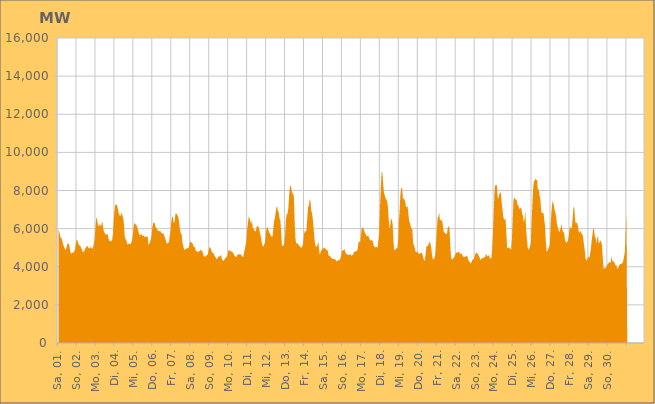
| Category | Series 0 |
|---|---|
|  Sa, 01.  | 5986.198 |
|  Sa, 01.  | 5851.716 |
|  Sa, 01.  | 5665.859 |
|  Sa, 01.  | 5525.576 |
|  Sa, 01.  | 5490.964 |
|  Sa, 01.  | 5345.422 |
|  Sa, 01.  | 5175.467 |
|  Sa, 01.  | 5066.246 |
|  Sa, 01.  | 4964.411 |
|  Sa, 01.  | 4859.392 |
|  Sa, 01.  | 4981.299 |
|  Sa, 01.  | 5156.284 |
|  Sa, 01.  | 5203.352 |
|  Sa, 01.  | 5224.294 |
|  Sa, 01.  | 5064.415 |
|  Sa, 01.  | 4799.154 |
|  Sa, 01.  | 4692.39 |
|  So, 02.  | 4701.01 |
|  So, 02.  | 4738.124 |
|  So, 02.  | 4750.208 |
|  So, 02.  | 4797.907 |
|  So, 02.  | 4901.259 |
|  So, 02.  | 5133.199 |
|  So, 02.  | 5404.292 |
|  So, 02.  | 5409.799 |
|  So, 02.  | 5249.454 |
|  So, 02.  | 5146.405 |
|  So, 02.  | 5105.129 |
|  So, 02.  | 5077.2 |
|  So, 02.  | 4963.275 |
|  So, 02.  | 4877.738 |
|  So, 02.  | 4746.793 |
|  So, 02.  | 4789.26 |
|  So, 02.  | 4837.976 |
|  So, 02.  | 4972.258 |
|  So, 02.  | 5001.209 |
|  So, 02.  | 5090.201 |
|  So, 02.  | 5071.623 |
|  So, 02.  | 4992.963 |
|  So, 02.  | 4963.147 |
|  So, 02.  | 4970.084 |
|  Mo, 03.  | 5050.649 |
|  Mo, 03.  | 4982.216 |
|  Mo, 03.  | 4929.272 |
|  Mo, 03.  | 5025.858 |
|  Mo, 03.  | 5231.767 |
|  Mo, 03.  | 5485.965 |
|  Mo, 03.  | 6151.951 |
|  Mo, 03.  | 6603.216 |
|  Mo, 03.  | 6448.466 |
|  Mo, 03.  | 6229.15 |
|  Mo, 03.  | 6100.831 |
|  Mo, 03.  | 6217.637 |
|  Mo, 03.  | 6217.682 |
|  Mo, 03.  | 6105.206 |
|  Mo, 03.  | 6325.348 |
|  Mo, 03.  | 6302.314 |
|  Mo, 03.  | 5946.717 |
|  Mo, 03.  | 5796.827 |
|  Mo, 03.  | 5766.763 |
|  Mo, 03.  | 5642.512 |
|  Mo, 03.  | 5713.603 |
|  Mo, 03.  | 5729.058 |
|  Mo, 03.  | 5577.282 |
|  Mo, 03.  | 5364.547 |
|  Di, 04.  | 5369.278 |
|  Di, 04.  | 5321.963 |
|  Di, 04.  | 5358.114 |
|  Di, 04.  | 5394.184 |
|  Di, 04.  | 5716.389 |
|  Di, 04.  | 6404.431 |
|  Di, 04.  | 6966.311 |
|  Di, 04.  | 7244.627 |
|  Di, 04.  | 7274.732 |
|  Di, 04.  | 7248.583 |
|  Di, 04.  | 7091.509 |
|  Di, 04.  | 6866.441 |
|  Di, 04.  | 6750.98 |
|  Di, 04.  | 6649.284 |
|  Di, 04.  | 6712.508 |
|  Di, 04.  | 6850.34 |
|  Di, 04.  | 6682.705 |
|  Di, 04.  | 6564.801 |
|  Di, 04.  | 6210.16 |
|  Di, 04.  | 5587.202 |
|  Di, 04.  | 5452.3 |
|  Di, 04.  | 5366.774 |
|  Di, 04.  | 5219.316 |
|  Di, 04.  | 5155.671 |
|  Mi, 05.  | 5220.792 |
|  Mi, 05.  | 5237.349 |
|  Mi, 05.  | 5152.427 |
|  Mi, 05.  | 5241.705 |
|  Mi, 05.  | 5363.147 |
|  Mi, 05.  | 5559.005 |
|  Mi, 05.  | 6037.3 |
|  Mi, 05.  | 6308.622 |
|  Mi, 05.  | 6242.978 |
|  Mi, 05.  | 6207.199 |
|  Mi, 05.  | 6173.768 |
|  Mi, 05.  | 6039.272 |
|  Mi, 05.  | 5904.469 |
|  Mi, 05.  | 5726.8 |
|  Mi, 05.  | 5648.026 |
|  Mi, 05.  | 5649.455 |
|  Mi, 05.  | 5753.626 |
|  Mi, 05.  | 5630.197 |
|  Mi, 05.  | 5642.762 |
|  Mi, 05.  | 5620.626 |
|  Mi, 05.  | 5556.902 |
|  Mi, 05.  | 5576.803 |
|  Mi, 05.  | 5567.333 |
|  Mi, 05.  | 5589.218 |
|  Do, 06.  | 5592.973 |
|  Do, 06.  | 5123.907 |
|  Do, 06.  | 5202.075 |
|  Do, 06.  | 5297.194 |
|  Do, 06.  | 5432.616 |
|  Do, 06.  | 5669.47 |
|  Do, 06.  | 6082.247 |
|  Do, 06.  | 6300.495 |
|  Do, 06.  | 6320.121 |
|  Do, 06.  | 6273.655 |
|  Do, 06.  | 6094.1 |
|  Do, 06.  | 5994.084 |
|  Do, 06.  | 5999.222 |
|  Do, 06.  | 5869.058 |
|  Do, 06.  | 5886.096 |
|  Do, 06.  | 5862.3 |
|  Do, 06.  | 5895.214 |
|  Do, 06.  | 5784.538 |
|  Do, 06.  | 5783.343 |
|  Do, 06.  | 5711.813 |
|  Do, 06.  | 5759.064 |
|  Do, 06.  | 5636.405 |
|  Do, 06.  | 5500.982 |
|  Do, 06.  | 5390.22 |
|  Fr, 07.  | 5217.608 |
|  Fr, 07.  | 5226.2 |
|  Fr, 07.  | 5254.497 |
|  Fr, 07.  | 5293.826 |
|  Fr, 07.  | 5655.095 |
|  Fr, 07.  | 5896.305 |
|  Fr, 07.  | 6374.028 |
|  Fr, 07.  | 6640.231 |
|  Fr, 07.  | 6586.318 |
|  Fr, 07.  | 6303.294 |
|  Fr, 07.  | 6333.069 |
|  Fr, 07.  | 6733.798 |
|  Fr, 07.  | 6814.319 |
|  Fr, 07.  | 6737.536 |
|  Fr, 07.  | 6664.447 |
|  Fr, 07.  | 6575.157 |
|  Fr, 07.  | 6244.352 |
|  Fr, 07.  | 5917.623 |
|  Fr, 07.  | 5738.251 |
|  Fr, 07.  | 5688.585 |
|  Fr, 07.  | 5279.098 |
|  Fr, 07.  | 5089.484 |
|  Fr, 07.  | 4923.09 |
|  Fr, 07.  | 4886.802 |
|  Sa, 08.  | 4920.208 |
|  Sa, 08.  | 4956.678 |
|  Sa, 08.  | 4966.173 |
|  Sa, 08.  | 4983.251 |
|  Sa, 08.  | 5000.741 |
|  Sa, 08.  | 5191.07 |
|  Sa, 08.  | 5337.723 |
|  Sa, 08.  | 5254.819 |
|  Sa, 08.  | 5288.232 |
|  Sa, 08.  | 5201.02 |
|  Sa, 08.  | 5067.645 |
|  Sa, 08.  | 5030.667 |
|  Sa, 08.  | 5015.464 |
|  Sa, 08.  | 4807.369 |
|  Sa, 08.  | 4832.864 |
|  Sa, 08.  | 4771.201 |
|  Sa, 08.  | 4760.364 |
|  Sa, 08.  | 4831.947 |
|  Sa, 08.  | 4825.434 |
|  Sa, 08.  | 4908.169 |
|  Sa, 08.  | 4844.909 |
|  Sa, 08.  | 4836.937 |
|  Sa, 08.  | 4687.435 |
|  Sa, 08.  | 4545.265 |
|  So, 09.  | 4560.465 |
|  So, 09.  | 4524.437 |
|  So, 09.  | 4573.328 |
|  So, 09.  | 4606.458 |
|  So, 09.  | 4654.101 |
|  So, 09.  | 4828.246 |
|  So, 09.  | 5024.234 |
|  So, 09.  | 5015.126 |
|  So, 09.  | 4939.169 |
|  So, 09.  | 4809.438 |
|  So, 09.  | 4737.247 |
|  So, 09.  | 4718.937 |
|  So, 09.  | 4649.321 |
|  So, 09.  | 4556.93 |
|  So, 09.  | 4491.298 |
|  So, 09.  | 4423.45 |
|  So, 09.  | 4402.622 |
|  So, 09.  | 4513.211 |
|  So, 09.  | 4534.018 |
|  So, 09.  | 4537.643 |
|  So, 09.  | 4573.7 |
|  So, 09.  | 4610.516 |
|  So, 09.  | 4403.32 |
|  So, 09.  | 4328.008 |
|  Mo, 10.  | 4313.69 |
|  Mo, 10.  | 4350.451 |
|  Mo, 10.  | 4454.101 |
|  Mo, 10.  | 4471.908 |
|  Mo, 10.  | 4525.516 |
|  Mo, 10.  | 4589.599 |
|  Mo, 10.  | 4835.402 |
|  Mo, 10.  | 4875.788 |
|  Mo, 10.  | 4849.937 |
|  Mo, 10.  | 4811.948 |
|  Mo, 10.  | 4783.219 |
|  Mo, 10.  | 4804.859 |
|  Mo, 10.  | 4700.804 |
|  Mo, 10.  | 4693.104 |
|  Mo, 10.  | 4559.146 |
|  Mo, 10.  | 4538.54 |
|  Mo, 10.  | 4503.301 |
|  Mo, 10.  | 4586.425 |
|  Mo, 10.  | 4633.529 |
|  Mo, 10.  | 4654.224 |
|  Mo, 10.  | 4638.368 |
|  Mo, 10.  | 4665.499 |
|  Mo, 10.  | 4629.46 |
|  Mo, 10.  | 4584.774 |
|  Di, 11.  | 4515.636 |
|  Di, 11.  | 4513.594 |
|  Di, 11.  | 4749.006 |
|  Di, 11.  | 4923.289 |
|  Di, 11.  | 5166.781 |
|  Di, 11.  | 5410.52 |
|  Di, 11.  | 5993.565 |
|  Di, 11.  | 6314.311 |
|  Di, 11.  | 6644.665 |
|  Di, 11.  | 6548.064 |
|  Di, 11.  | 6389.762 |
|  Di, 11.  | 6241.821 |
|  Di, 11.  | 6447.271 |
|  Di, 11.  | 6018.247 |
|  Di, 11.  | 6006.331 |
|  Di, 11.  | 5917.129 |
|  Di, 11.  | 5854.363 |
|  Di, 11.  | 5881.058 |
|  Di, 11.  | 6117.571 |
|  Di, 11.  | 6135.015 |
|  Di, 11.  | 6126.246 |
|  Di, 11.  | 6013.85 |
|  Di, 11.  | 5793.643 |
|  Di, 11.  | 5616.036 |
|  Mi, 12.  | 5350.768 |
|  Mi, 12.  | 5140.144 |
|  Mi, 12.  | 5057.796 |
|  Mi, 12.  | 5103.276 |
|  Mi, 12.  | 5215.764 |
|  Mi, 12.  | 5400.214 |
|  Mi, 12.  | 5881.592 |
|  Mi, 12.  | 6079.563 |
|  Mi, 12.  | 6057.197 |
|  Mi, 12.  | 5897.177 |
|  Mi, 12.  | 5785.509 |
|  Mi, 12.  | 5716.352 |
|  Mi, 12.  | 5617.394 |
|  Mi, 12.  | 5577.19 |
|  Mi, 12.  | 5565.1 |
|  Mi, 12.  | 5971.671 |
|  Mi, 12.  | 6404.574 |
|  Mi, 12.  | 6553.018 |
|  Mi, 12.  | 6847.14 |
|  Mi, 12.  | 7125.42 |
|  Mi, 12.  | 7153.375 |
|  Mi, 12.  | 6910.197 |
|  Mi, 12.  | 6839.746 |
|  Mi, 12.  | 6503.308 |
|  Do, 13.  | 6433.625 |
|  Do, 13.  | 5731.408 |
|  Do, 13.  | 5111.768 |
|  Do, 13.  | 5086.446 |
|  Do, 13.  | 5128.565 |
|  Do, 13.  | 5227.96 |
|  Do, 13.  | 5661.708 |
|  Do, 13.  | 6473.824 |
|  Do, 13.  | 6789.672 |
|  Do, 13.  | 6749.167 |
|  Do, 13.  | 7037.479 |
|  Do, 13.  | 7698.574 |
|  Do, 13.  | 8151.005 |
|  Do, 13.  | 8297.964 |
|  Do, 13.  | 8062.462 |
|  Do, 13.  | 7878.674 |
|  Do, 13.  | 7816.829 |
|  Do, 13.  | 7726.26 |
|  Do, 13.  | 6384.504 |
|  Do, 13.  | 5497.894 |
|  Do, 13.  | 5217.125 |
|  Do, 13.  | 5219.659 |
|  Do, 13.  | 5232.731 |
|  Do, 13.  | 5126.546 |
|  Fr, 14.  | 5113.975 |
|  Fr, 14.  | 5040.781 |
|  Fr, 14.  | 4987.049 |
|  Fr, 14.  | 5039.468 |
|  Fr, 14.  | 5082.219 |
|  Fr, 14.  | 5319.642 |
|  Fr, 14.  | 5723.604 |
|  Fr, 14.  | 5893.5 |
|  Fr, 14.  | 5830.553 |
|  Fr, 14.  | 5925.785 |
|  Fr, 14.  | 6526.251 |
|  Fr, 14.  | 7167.226 |
|  Fr, 14.  | 7160.532 |
|  Fr, 14.  | 7540.664 |
|  Fr, 14.  | 7449.462 |
|  Fr, 14.  | 6941.866 |
|  Fr, 14.  | 6809.054 |
|  Fr, 14.  | 6517.055 |
|  Fr, 14.  | 6010.954 |
|  Fr, 14.  | 5513.725 |
|  Fr, 14.  | 5168.556 |
|  Fr, 14.  | 5047.032 |
|  Fr, 14.  | 5046.815 |
|  Fr, 14.  | 5144.114 |
|  Sa, 15.  | 5326.562 |
|  Sa, 15.  | 4879.498 |
|  Sa, 15.  | 4625.235 |
|  Sa, 15.  | 4770.753 |
|  Sa, 15.  | 4869.31 |
|  Sa, 15.  | 4922.679 |
|  Sa, 15.  | 5028.747 |
|  Sa, 15.  | 4927.38 |
|  Sa, 15.  | 5008.507 |
|  Sa, 15.  | 4956.719 |
|  Sa, 15.  | 4857.615 |
|  Sa, 15.  | 4919.958 |
|  Sa, 15.  | 4823.856 |
|  Sa, 15.  | 4580.557 |
|  Sa, 15.  | 4587.427 |
|  Sa, 15.  | 4543.437 |
|  Sa, 15.  | 4460.201 |
|  Sa, 15.  | 4464.991 |
|  Sa, 15.  | 4403.821 |
|  Sa, 15.  | 4414.485 |
|  Sa, 15.  | 4394.965 |
|  Sa, 15.  | 4397.61 |
|  Sa, 15.  | 4368.478 |
|  Sa, 15.  | 4269.901 |
|  So, 16.  | 4315.484 |
|  So, 16.  | 4351.759 |
|  So, 16.  | 4328.83 |
|  So, 16.  | 4355.487 |
|  So, 16.  | 4460.689 |
|  So, 16.  | 4569.429 |
|  So, 16.  | 4834.414 |
|  So, 16.  | 4844.176 |
|  So, 16.  | 4869.942 |
|  So, 16.  | 4952.319 |
|  So, 16.  | 4772.661 |
|  So, 16.  | 4698.097 |
|  So, 16.  | 4661.702 |
|  So, 16.  | 4629.209 |
|  So, 16.  | 4620.665 |
|  So, 16.  | 4631.716 |
|  So, 16.  | 4634.084 |
|  So, 16.  | 4655.039 |
|  So, 16.  | 4569.875 |
|  So, 16.  | 4609.234 |
|  So, 16.  | 4628.559 |
|  So, 16.  | 4767.856 |
|  So, 16.  | 4783.526 |
|  So, 16.  | 4810.766 |
|  Mo, 17.  | 4815.53 |
|  Mo, 17.  | 4825.86 |
|  Mo, 17.  | 4977.354 |
|  Mo, 17.  | 5322.576 |
|  Mo, 17.  | 5326.058 |
|  Mo, 17.  | 5255.659 |
|  Mo, 17.  | 5640.374 |
|  Mo, 17.  | 6018.336 |
|  Mo, 17.  | 6072.486 |
|  Mo, 17.  | 6013.517 |
|  Mo, 17.  | 5908.31 |
|  Mo, 17.  | 5765.806 |
|  Mo, 17.  | 5709.417 |
|  Mo, 17.  | 5594.468 |
|  Mo, 17.  | 5605.154 |
|  Mo, 17.  | 5635.342 |
|  Mo, 17.  | 5548.649 |
|  Mo, 17.  | 5432.43 |
|  Mo, 17.  | 5388.381 |
|  Mo, 17.  | 5371.203 |
|  Mo, 17.  | 5396.32 |
|  Mo, 17.  | 5335.188 |
|  Mo, 17.  | 5108.107 |
|  Mo, 17.  | 5076.283 |
|  Di, 18.  | 5002.953 |
|  Di, 18.  | 5045.017 |
|  Di, 18.  | 5038.616 |
|  Di, 18.  | 4981.414 |
|  Di, 18.  | 5379.975 |
|  Di, 18.  | 5773.671 |
|  Di, 18.  | 7022.398 |
|  Di, 18.  | 8038.352 |
|  Di, 18.  | 8928.718 |
|  Di, 18.  | 8984.47 |
|  Di, 18.  | 8381.545 |
|  Di, 18.  | 7911.576 |
|  Di, 18.  | 7754.579 |
|  Di, 18.  | 7607.03 |
|  Di, 18.  | 7521.693 |
|  Di, 18.  | 7451.32 |
|  Di, 18.  | 7187.495 |
|  Di, 18.  | 6534.141 |
|  Di, 18.  | 5982.196 |
|  Di, 18.  | 6179.521 |
|  Di, 18.  | 6521.78 |
|  Di, 18.  | 6462.776 |
|  Di, 18.  | 6260.197 |
|  Di, 18.  | 5369.708 |
|  Mi, 19.  | 4887.347 |
|  Mi, 19.  | 4885.413 |
|  Mi, 19.  | 4909.748 |
|  Mi, 19.  | 4995.699 |
|  Mi, 19.  | 4938.972 |
|  Mi, 19.  | 5334.404 |
|  Mi, 19.  | 6361.133 |
|  Mi, 19.  | 7028.438 |
|  Mi, 19.  | 7843.639 |
|  Mi, 19.  | 8116.473 |
|  Mi, 19.  | 8173.435 |
|  Mi, 19.  | 7636.002 |
|  Mi, 19.  | 7547.967 |
|  Mi, 19.  | 7521.281 |
|  Mi, 19.  | 7416.236 |
|  Mi, 19.  | 7117.726 |
|  Mi, 19.  | 7157.673 |
|  Mi, 19.  | 7155.243 |
|  Mi, 19.  | 6787.61 |
|  Mi, 19.  | 6365.825 |
|  Mi, 19.  | 6313.912 |
|  Mi, 19.  | 6113.234 |
|  Mi, 19.  | 5989.942 |
|  Mi, 19.  | 5972.191 |
|  Do, 20.  | 5263.174 |
|  Do, 20.  | 5137.708 |
|  Do, 20.  | 5015.659 |
|  Do, 20.  | 4792.31 |
|  Do, 20.  | 4787.252 |
|  Do, 20.  | 4740.29 |
|  Do, 20.  | 4804.733 |
|  Do, 20.  | 4671.639 |
|  Do, 20.  | 4671.021 |
|  Do, 20.  | 4695.936 |
|  Do, 20.  | 4735.164 |
|  Do, 20.  | 4719.327 |
|  Do, 20.  | 4623.682 |
|  Do, 20.  | 4440.571 |
|  Do, 20.  | 4311.64 |
|  Do, 20.  | 4362.731 |
|  Do, 20.  | 4758.672 |
|  Do, 20.  | 5110.376 |
|  Do, 20.  | 5057.688 |
|  Do, 20.  | 5142.002 |
|  Do, 20.  | 5208.133 |
|  Do, 20.  | 5333.842 |
|  Do, 20.  | 5207.898 |
|  Do, 20.  | 4943.382 |
|  Fr, 21.  | 4600.083 |
|  Fr, 21.  | 4381.035 |
|  Fr, 21.  | 4400.204 |
|  Fr, 21.  | 4470.557 |
|  Fr, 21.  | 4642.675 |
|  Fr, 21.  | 5230.028 |
|  Fr, 21.  | 5915.933 |
|  Fr, 21.  | 6555.258 |
|  Fr, 21.  | 6639.848 |
|  Fr, 21.  | 6844.193 |
|  Fr, 21.  | 6392.851 |
|  Fr, 21.  | 6490.85 |
|  Fr, 21.  | 6425.363 |
|  Fr, 21.  | 6378.656 |
|  Fr, 21.  | 6024.172 |
|  Fr, 21.  | 5812.314 |
|  Fr, 21.  | 5793.44 |
|  Fr, 21.  | 5747.689 |
|  Fr, 21.  | 5708.591 |
|  Fr, 21.  | 5764.872 |
|  Fr, 21.  | 6093.949 |
|  Fr, 21.  | 6127.1 |
|  Fr, 21.  | 6009.08 |
|  Fr, 21.  | 5121.94 |
|  Sa, 22.  | 4507.456 |
|  Sa, 22.  | 4381.524 |
|  Sa, 22.  | 4378.576 |
|  Sa, 22.  | 4458.684 |
|  Sa, 22.  | 4482.244 |
|  Sa, 22.  | 4595.188 |
|  Sa, 22.  | 4699.095 |
|  Sa, 22.  | 4745.786 |
|  Sa, 22.  | 4728.422 |
|  Sa, 22.  | 4773.757 |
|  Sa, 22.  | 4775.432 |
|  Sa, 22.  | 4724.938 |
|  Sa, 22.  | 4650.379 |
|  Sa, 22.  | 4717.316 |
|  Sa, 22.  | 4647.031 |
|  Sa, 22.  | 4565.041 |
|  Sa, 22.  | 4501.631 |
|  Sa, 22.  | 4528.32 |
|  Sa, 22.  | 4501.264 |
|  Sa, 22.  | 4596.628 |
|  Sa, 22.  | 4552.954 |
|  Sa, 22.  | 4523.449 |
|  Sa, 22.  | 4324.199 |
|  Sa, 22.  | 4266.525 |
|  So, 23.  | 4236.744 |
|  So, 23.  | 4151.313 |
|  So, 23.  | 4258.332 |
|  So, 23.  | 4361.724 |
|  So, 23.  | 4384.806 |
|  So, 23.  | 4410.065 |
|  So, 23.  | 4592.869 |
|  So, 23.  | 4668.631 |
|  So, 23.  | 4749.568 |
|  So, 23.  | 4712.791 |
|  So, 23.  | 4665.631 |
|  So, 23.  | 4575.113 |
|  So, 23.  | 4505.585 |
|  So, 23.  | 4380.278 |
|  So, 23.  | 4360.492 |
|  So, 23.  | 4469.073 |
|  So, 23.  | 4433.222 |
|  So, 23.  | 4463.861 |
|  So, 23.  | 4507.03 |
|  So, 23.  | 4494.724 |
|  So, 23.  | 4647.566 |
|  So, 23.  | 4636.426 |
|  So, 23.  | 4541.85 |
|  So, 23.  | 4570.311 |
|  Mo, 24.  | 4619.116 |
|  Mo, 24.  | 4469.271 |
|  Mo, 24.  | 4418.445 |
|  Mo, 24.  | 4458.192 |
|  Mo, 24.  | 4874.409 |
|  Mo, 24.  | 5742.46 |
|  Mo, 24.  | 6844.997 |
|  Mo, 24.  | 7982.794 |
|  Mo, 24.  | 8285.57 |
|  Mo, 24.  | 8272.889 |
|  Mo, 24.  | 8276.666 |
|  Mo, 24.  | 7634.534 |
|  Mo, 24.  | 7561.745 |
|  Mo, 24.  | 7827.216 |
|  Mo, 24.  | 7807.603 |
|  Mo, 24.  | 7949.833 |
|  Mo, 24.  | 7392.299 |
|  Mo, 24.  | 7065.89 |
|  Mo, 24.  | 6661.216 |
|  Mo, 24.  | 6477.811 |
|  Mo, 24.  | 6465.308 |
|  Mo, 24.  | 6538.039 |
|  Mo, 24.  | 5765.402 |
|  Mo, 24.  | 4961.253 |
|  Di, 25.  | 4991.465 |
|  Di, 25.  | 5029.213 |
|  Di, 25.  | 4980.984 |
|  Di, 25.  | 4946.57 |
|  Di, 25.  | 4885.597 |
|  Di, 25.  | 5419.006 |
|  Di, 25.  | 6338.35 |
|  Di, 25.  | 7487.125 |
|  Di, 25.  | 7633.372 |
|  Di, 25.  | 7581.155 |
|  Di, 25.  | 7510.285 |
|  Di, 25.  | 7500.239 |
|  Di, 25.  | 7220.893 |
|  Di, 25.  | 7260.084 |
|  Di, 25.  | 7092.228 |
|  Di, 25.  | 7000.578 |
|  Di, 25.  | 7123.847 |
|  Di, 25.  | 7054.91 |
|  Di, 25.  | 6783.174 |
|  Di, 25.  | 6663.291 |
|  Di, 25.  | 6329.616 |
|  Di, 25.  | 6458.671 |
|  Di, 25.  | 6922.781 |
|  Di, 25.  | 5978.116 |
|  Mi, 26.  | 5449.027 |
|  Mi, 26.  | 5012.538 |
|  Mi, 26.  | 4897.932 |
|  Mi, 26.  | 4946.792 |
|  Mi, 26.  | 5058.488 |
|  Mi, 26.  | 5257.221 |
|  Mi, 26.  | 6367.368 |
|  Mi, 26.  | 7330.642 |
|  Mi, 26.  | 8169.915 |
|  Mi, 26.  | 8507.336 |
|  Mi, 26.  | 8520.827 |
|  Mi, 26.  | 8624.181 |
|  Mi, 26.  | 8544.77 |
|  Mi, 26.  | 8546.497 |
|  Mi, 26.  | 7946.443 |
|  Mi, 26.  | 8148.676 |
|  Mi, 26.  | 7727.026 |
|  Mi, 26.  | 7566.064 |
|  Mi, 26.  | 6973.186 |
|  Mi, 26.  | 6788.541 |
|  Mi, 26.  | 6833.03 |
|  Mi, 26.  | 6827.557 |
|  Mi, 26.  | 6473.275 |
|  Mi, 26.  | 6109.438 |
|  Do, 27.  | 5330.576 |
|  Do, 27.  | 4791.326 |
|  Do, 27.  | 4832.065 |
|  Do, 27.  | 4935.492 |
|  Do, 27.  | 5020.82 |
|  Do, 27.  | 5141.674 |
|  Do, 27.  | 6077.609 |
|  Do, 27.  | 6848.236 |
|  Do, 27.  | 7299.823 |
|  Do, 27.  | 7481.088 |
|  Do, 27.  | 7224.546 |
|  Do, 27.  | 6996.053 |
|  Do, 27.  | 6860.007 |
|  Do, 27.  | 6650.941 |
|  Do, 27.  | 6226.712 |
|  Do, 27.  | 6079.973 |
|  Do, 27.  | 5934.056 |
|  Do, 27.  | 5807.669 |
|  Do, 27.  | 5913.084 |
|  Do, 27.  | 6083.653 |
|  Do, 27.  | 6231.996 |
|  Do, 27.  | 5908.487 |
|  Do, 27.  | 5790.304 |
|  Do, 27.  | 5826.44 |
|  Fr, 28.  | 5469.14 |
|  Fr, 28.  | 5298.911 |
|  Fr, 28.  | 5248.921 |
|  Fr, 28.  | 5313.615 |
|  Fr, 28.  | 5371.45 |
|  Fr, 28.  | 5604.89 |
|  Fr, 28.  | 6000.697 |
|  Fr, 28.  | 6128.747 |
|  Fr, 28.  | 5974.343 |
|  Fr, 28.  | 6073.326 |
|  Fr, 28.  | 6599.804 |
|  Fr, 28.  | 7154.126 |
|  Fr, 28.  | 7074.732 |
|  Fr, 28.  | 6425.727 |
|  Fr, 28.  | 6279.87 |
|  Fr, 28.  | 6321.928 |
|  Fr, 28.  | 6251.861 |
|  Fr, 28.  | 6010.536 |
|  Fr, 28.  | 5770.484 |
|  Fr, 28.  | 5841.438 |
|  Fr, 28.  | 5873.854 |
|  Fr, 28.  | 5745.494 |
|  Fr, 28.  | 5721.046 |
|  Fr, 28.  | 5607.544 |
|  Sa, 29.  | 5232.202 |
|  Sa, 29.  | 4906.259 |
|  Sa, 29.  | 4539.195 |
|  Sa, 29.  | 4317.604 |
|  Sa, 29.  | 4366.871 |
|  Sa, 29.  | 4472.744 |
|  Sa, 29.  | 4523.628 |
|  Sa, 29.  | 4463.004 |
|  Sa, 29.  | 4682.077 |
|  Sa, 29.  | 4940.261 |
|  Sa, 29.  | 5393.162 |
|  Sa, 29.  | 5678.947 |
|  Sa, 29.  | 6027.25 |
|  Sa, 29.  | 5970.18 |
|  Sa, 29.  | 5571.219 |
|  Sa, 29.  | 5526.963 |
|  Sa, 29.  | 5220.239 |
|  Sa, 29.  | 5475.833 |
|  Sa, 29.  | 5641.051 |
|  Sa, 29.  | 5196.718 |
|  Sa, 29.  | 5294.794 |
|  Sa, 29.  | 5396.904 |
|  Sa, 29.  | 5290.179 |
|  Sa, 29.  | 5155.163 |
|  So, 30.  | 4500.242 |
|  So, 30.  | 3870.068 |
|  So, 30.  | 3929.977 |
|  So, 30.  | 3919.511 |
|  So, 30.  | 3943.175 |
|  So, 30.  | 3988.563 |
|  So, 30.  | 4146.164 |
|  So, 30.  | 4159.751 |
|  So, 30.  | 4242.185 |
|  So, 30.  | 4231.71 |
|  So, 30.  | 4206.325 |
|  So, 30.  | 4543.08 |
|  So, 30.  | 4331.732 |
|  So, 30.  | 4269.648 |
|  So, 30.  | 4285.482 |
|  So, 30.  | 4206.99 |
|  So, 30.  | 4057.562 |
|  So, 30.  | 4125.106 |
|  So, 30.  | 3907.311 |
|  So, 30.  | 3887.931 |
|  So, 30.  | 3987.659 |
|  So, 30.  | 4071.226 |
|  So, 30.  | 4147.429 |
|  So, 30.  | 4141.119 |
|  Mo, 01.  | 4160.548 |
|  Mo, 01.  | 4208.447 |
|  Mo, 01.  | 4311.119 |
|  Mo, 01.  | 4541.012 |
|  Mo, 01.  | 4764.243 |
|  Mo, 01.  | 5800.613 |
|    | 6721.113 |
|    | 0 |
|    | 0 |
|    | 0 |
|    | 0 |
|    | 0 |
|    | 0 |
|    | 0 |
|    | 0 |
|    | 0 |
|    | 0 |
|    | 0 |
|    | 0 |
|    | 0 |
|    | 0 |
|    | 0 |
|    | 0 |
|    | 0 |
|    | 0 |
|    | 0 |
|    | 0 |
|    | 0 |
|    | 0 |
|    | 0 |